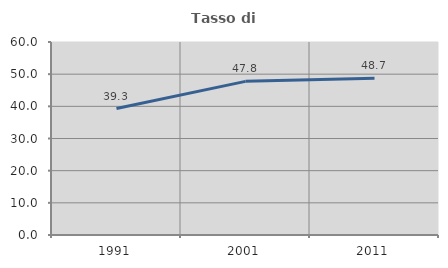
| Category | Tasso di occupazione   |
|---|---|
| 1991.0 | 39.301 |
| 2001.0 | 47.759 |
| 2011.0 | 48.716 |